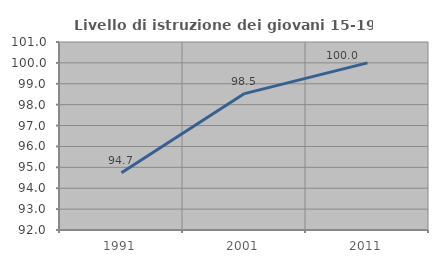
| Category | Livello di istruzione dei giovani 15-19 anni |
|---|---|
| 1991.0 | 94.737 |
| 2001.0 | 98.529 |
| 2011.0 | 100 |